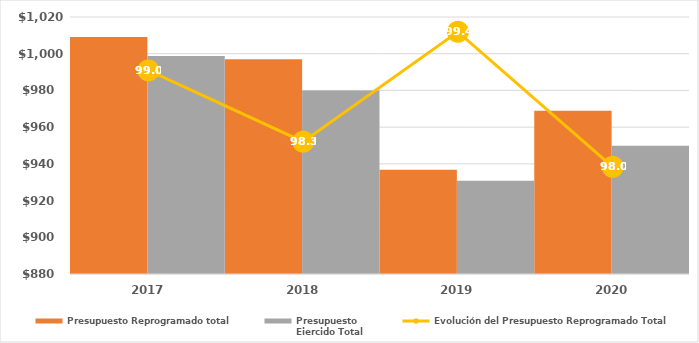
| Category | Presupuesto Reprogramado total | Presupuesto
Ejercido Total |
|---|---|---|
| 2017.0 | 1009095.712 | 998802.519 |
| 2018.0 | 996988 | 979910 |
| 2019.0 | 936775.686 | 930744.078 |
| 2020.0 | 968900.978 | 949931.095 |